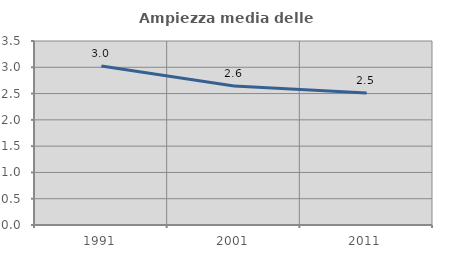
| Category | Ampiezza media delle famiglie |
|---|---|
| 1991.0 | 3.023 |
| 2001.0 | 2.643 |
| 2011.0 | 2.512 |